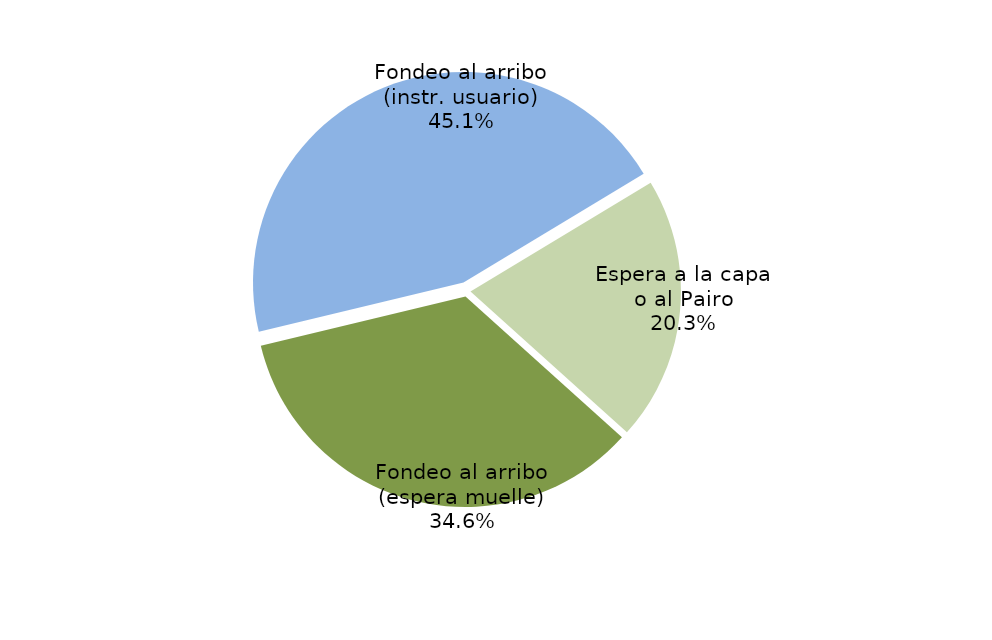
| Category | Series 0 |
|---|---|
| Fondeo al arribo (espera muelle) | 8536.743 |
| Fondeo al arribo (instr. usuario) | 11132.617 |
| Espera a la capa o al Pairo | 5015.267 |